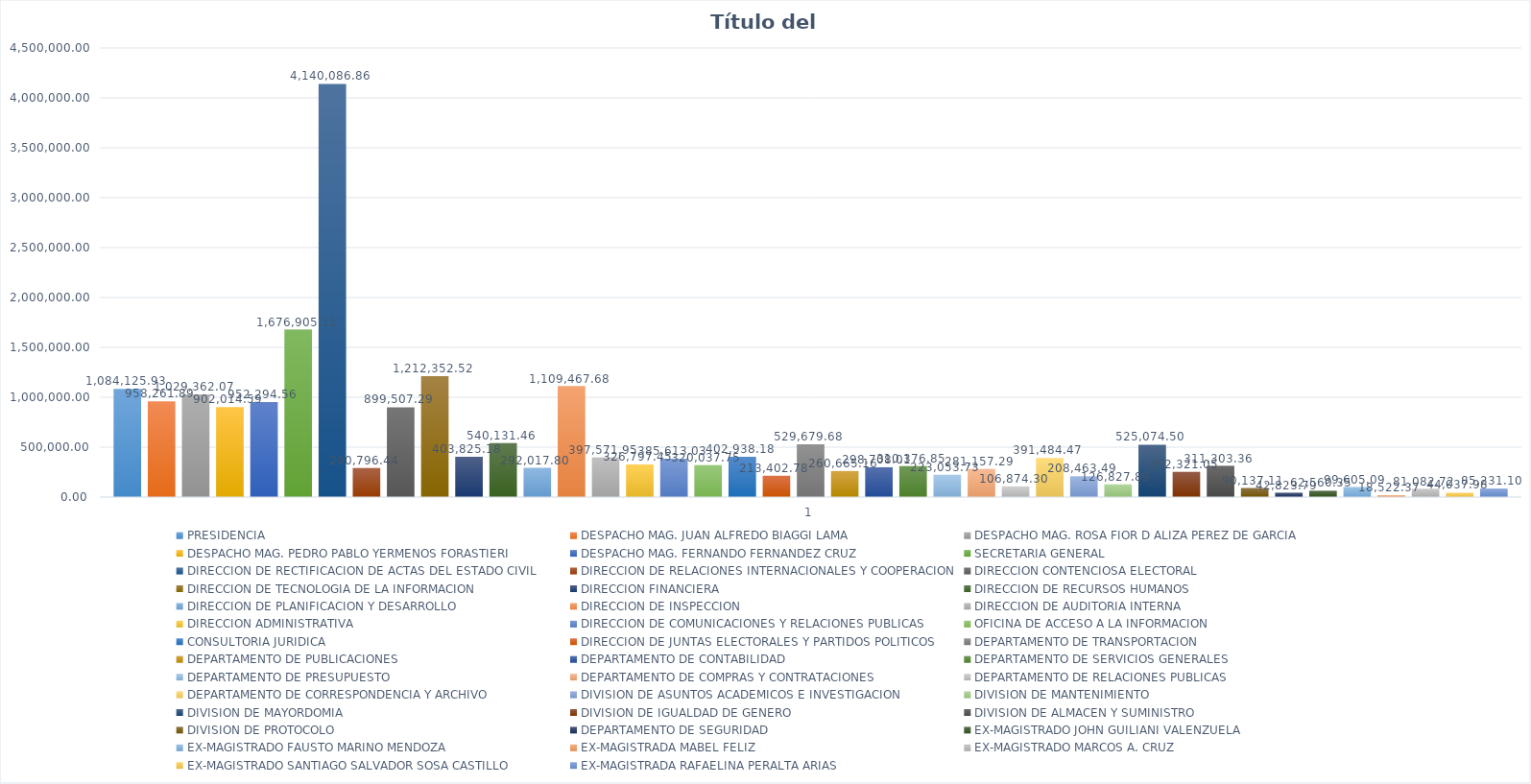
| Category | PRESIDENCIA | DESPACHO MAG. JUAN ALFREDO BIAGGI LAMA | DESPACHO MAG. ROSA FIOR D ALIZA PEREZ DE GARCIA | DESPACHO MAG. PEDRO PABLO YERMENOS FORASTIERI | DESPACHO MAG. FERNANDO FERNANDEZ CRUZ | SECRETARIA GENERAL | DIRECCION DE RECTIFICACION DE ACTAS DEL ESTADO CIVIL | DIRECCION DE RELACIONES INTERNACIONALES Y COOPERACION | DIRECCION CONTENCIOSA ELECTORAL | DIRECCION DE TECNOLOGIA DE LA INFORMACION | DIRECCION FINANCIERA | DIRECCION DE RECURSOS HUMANOS | DIRECCION DE PLANIFICACION Y DESARROLLO | DIRECCION DE INSPECCION | DIRECCION DE AUDITORIA INTERNA | DIRECCION ADMINISTRATIVA | DIRECCION DE COMUNICACIONES Y RELACIONES PUBLICAS | OFICINA DE ACCESO A LA INFORMACION | CONSULTORIA JURIDICA | DIRECCION DE JUNTAS ELECTORALES Y PARTIDOS POLITICOS | DEPARTAMENTO DE TRANSPORTACION | DEPARTAMENTO DE PUBLICACIONES | DEPARTAMENTO DE CONTABILIDAD | DEPARTAMENTO DE SERVICIOS GENERALES | DEPARTAMENTO DE PRESUPUESTO | DEPARTAMENTO DE COMPRAS Y CONTRATACIONES | DEPARTAMENTO DE RELACIONES PUBLICAS | DEPARTAMENTO DE CORRESPONDENCIA Y ARCHIVO | DIVISION DE ASUNTOS ACADEMICOS E INVESTIGACION | DIVISION DE MANTENIMIENTO | DIVISION DE MAYORDOMIA | DIVISION DE IGUALDAD DE GENERO | DIVISION DE ALMACEN Y SUMINISTRO | DIVISION DE PROTOCOLO  | DEPARTAMENTO DE SEGURIDAD | EX-MAGISTRADO JOHN GUILIANI VALENZUELA | EX-MAGISTRADO FAUSTO MARINO MENDOZA | EX-MAGISTRADA MABEL FELIZ | EX-MAGISTRADO MARCOS A. CRUZ | EX-MAGISTRADO SANTIAGO SALVADOR SOSA CASTILLO | EX-MAGISTRADA RAFAELINA PERALTA ARIAS |
|---|---|---|---|---|---|---|---|---|---|---|---|---|---|---|---|---|---|---|---|---|---|---|---|---|---|---|---|---|---|---|---|---|---|---|---|---|---|---|---|---|---|
| 0 | 1084125.934 | 958261.89 | 1029362.072 | 902014.595 | 952294.562 | 1676905.113 | 4140086.862 | 290796.443 | 899507.287 | 1212352.517 | 403825.181 | 540131.46 | 292017.8 | 1109467.678 | 397571.947 | 326797.447 | 385613.025 | 320037.749 | 402938.183 | 213402.777 | 529679.684 | 260665.164 | 298708.013 | 310376.85 | 223053.733 | 281157.293 | 106874.303 | 391484.473 | 208463.487 | 126827.89 | 525074.5 | 252321.05 | 311303.36 | 90137.11 | 42823.79 | 62560.35 | 99605.09 | 18522.37 | 81082.72 | 44037.98 | 85231.1 |